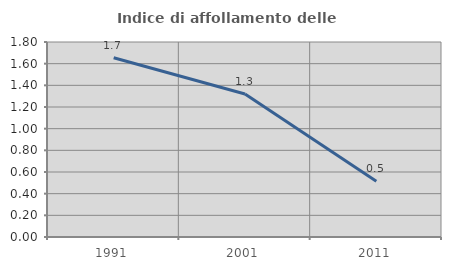
| Category | Indice di affollamento delle abitazioni  |
|---|---|
| 1991.0 | 1.654 |
| 2001.0 | 1.32 |
| 2011.0 | 0.515 |